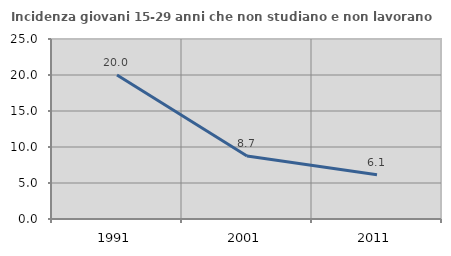
| Category | Incidenza giovani 15-29 anni che non studiano e non lavorano  |
|---|---|
| 1991.0 | 20 |
| 2001.0 | 8.746 |
| 2011.0 | 6.143 |